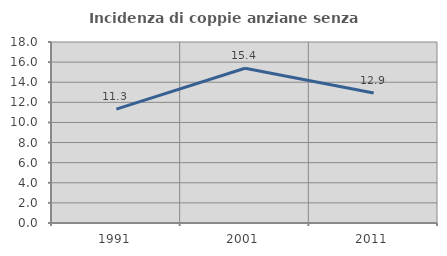
| Category | Incidenza di coppie anziane senza figli  |
|---|---|
| 1991.0 | 11.321 |
| 2001.0 | 15.385 |
| 2011.0 | 12.925 |